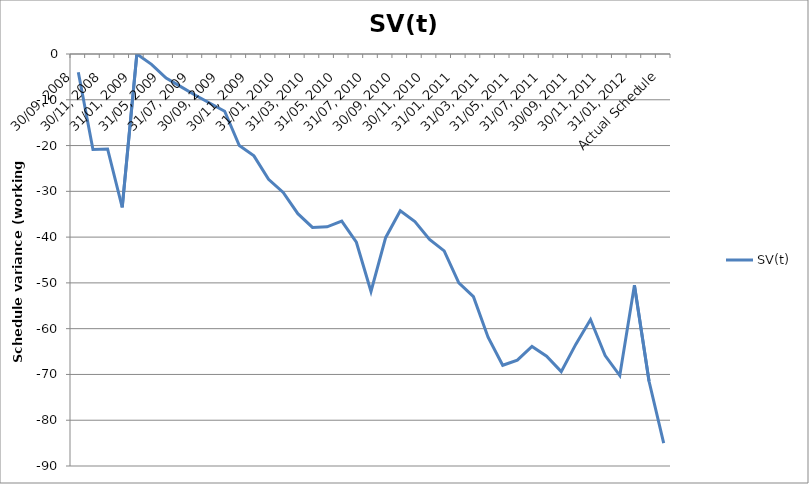
| Category | SV(t) |
|---|---|
| 30/09, 2008 | -4 |
| 31/10, 2008 | -20.875 |
| 30/11, 2008 | -20.75 |
| 31/12, 2008 | -33.5 |
| 31/01, 2009 | 0 |
| 30/04, 2009 | -2.25 |
| 31/05, 2009 | -5.25 |
| 30/06, 2009 | -7.125 |
| 31/07, 2009 | -9 |
| 31/08, 2009 | -10.75 |
| 30/09, 2009 | -12.5 |
| 31/10, 2009 | -20 |
| 30/11, 2009 | -22.25 |
| 31/12, 2009 | -27.375 |
| 31/01, 2010 | -30.25 |
| 28/02, 2010 | -34.875 |
| 31/03, 2010 | -37.875 |
| 30/04, 2010 | -37.75 |
| 31/05, 2010 | -36.5 |
| 30/06, 2010 | -41.125 |
| 31/07, 2010 | -51.875 |
| 31/08, 2010 | -40.125 |
| 30/09, 2010 | -34.25 |
| 31/10, 2010 | -36.625 |
| 30/11, 2010 | -40.5 |
| 31/12, 2010 | -43 |
| 31/01, 2011 | -50 |
| 28/02, 2011 | -53 |
| 31/03, 2011 | -61.875 |
| 30/04, 2011 | -68 |
| 31/05, 2011 | -66.875 |
| 30/06, 2011 | -63.875 |
| 31/07, 2011 | -66 |
| 31/08, 2011 | -69.375 |
| 30/09, 2011 | -63.375 |
| 31/10, 2011 | -58 |
| 30/11, 2011 | -65.875 |
| 31/12, 2011 | -70.25 |
| 31/01, 2012 | -50.5 |
| 29/02, 2012 | -71.5 |
| Actual Schedule | -85 |